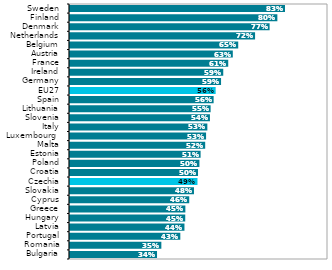
| Category | Series 1 |
|---|---|
| Bulgaria | 0.337 |
| Romania | 0.354 |
| Portugal | 0.428 |
| Latvia | 0.444 |
| Hungary | 0.447 |
| Greece | 0.447 |
| Cyprus | 0.462 |
| Slovakia | 0.481 |
| Czechia | 0.494 |
| Croatia | 0.496 |
| Poland | 0.502 |
| Estonia | 0.506 |
| Malta | 0.524 |
| Luxembourg  | 0.527 |
| Italy | 0.532 |
| Slovenia | 0.542 |
| Lithuania | 0.545 |
| Spain | 0.557 |
| EU27 | 0.565 |
| Germany | 0.585 |
| Ireland | 0.594 |
| France | 0.613 |
| Austria | 0.631 |
| Belgium | 0.652 |
| Netherlands | 0.717 |
| Denmark | 0.774 |
| Finland | 0.804 |
| Sweden | 0.833 |